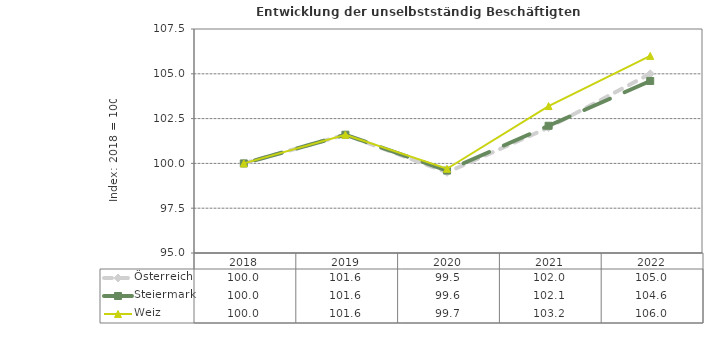
| Category | Österreich | Steiermark | Weiz |
|---|---|---|---|
| 2022.0 | 105 | 104.6 | 106 |
| 2021.0 | 102 | 102.1 | 103.2 |
| 2020.0 | 99.5 | 99.6 | 99.7 |
| 2019.0 | 101.6 | 101.6 | 101.6 |
| 2018.0 | 100 | 100 | 100 |